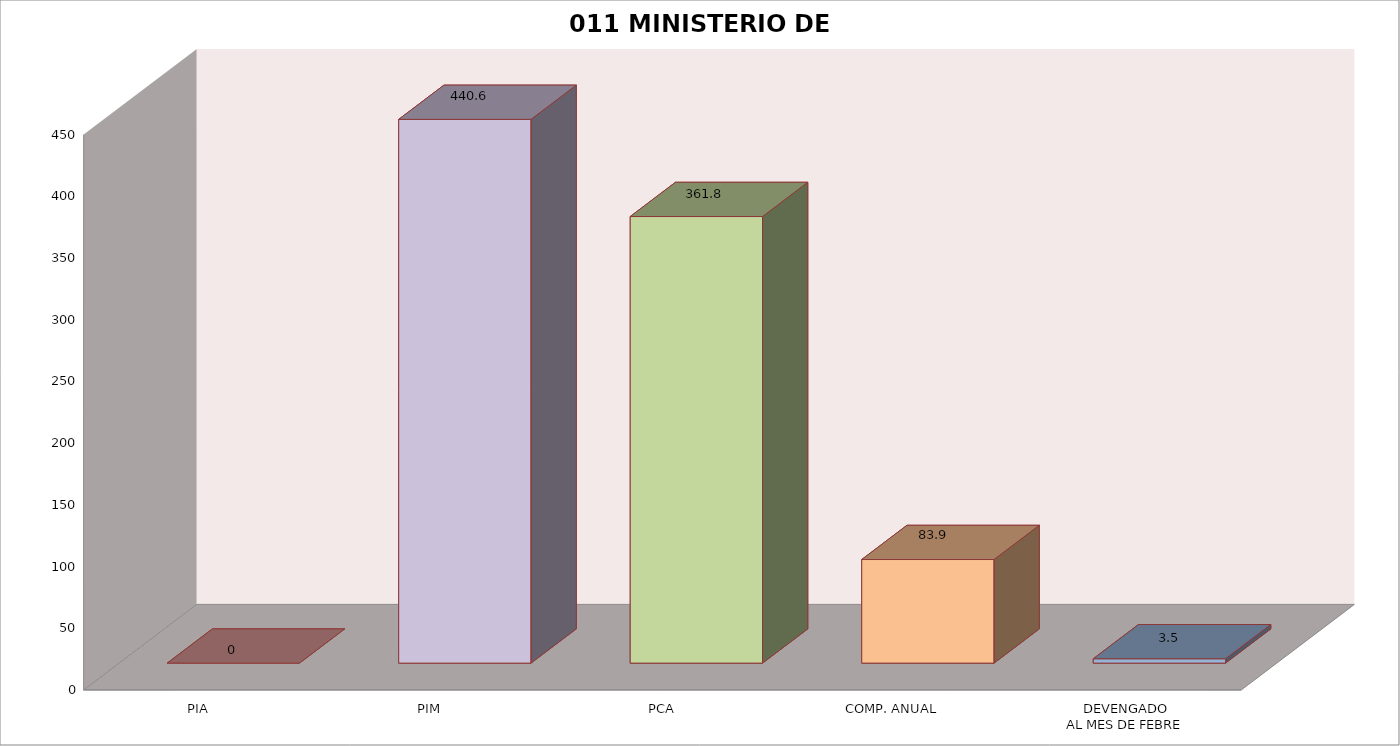
| Category | 011 MINISTERIO DE SALUD |
|---|---|
| PIA | 0 |
| PIM | 440.571 |
| PCA | 361.848 |
| COMP. ANUAL | 83.939 |
| DEVENGADO
AL MES DE FEBRE | 3.538 |